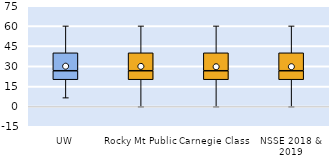
| Category | 25th | 50th | 75th |
|---|---|---|---|
| UW | 20 | 6.667 | 13.333 |
| Rocky Mt Public | 20 | 6.667 | 13.333 |
| Carnegie Class | 20 | 6.667 | 13.333 |
| NSSE 2018 & 2019 | 20 | 6.667 | 13.333 |